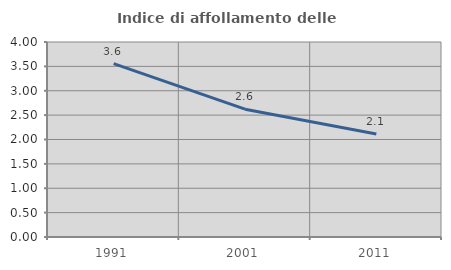
| Category | Indice di affollamento delle abitazioni  |
|---|---|
| 1991.0 | 3.557 |
| 2001.0 | 2.622 |
| 2011.0 | 2.112 |